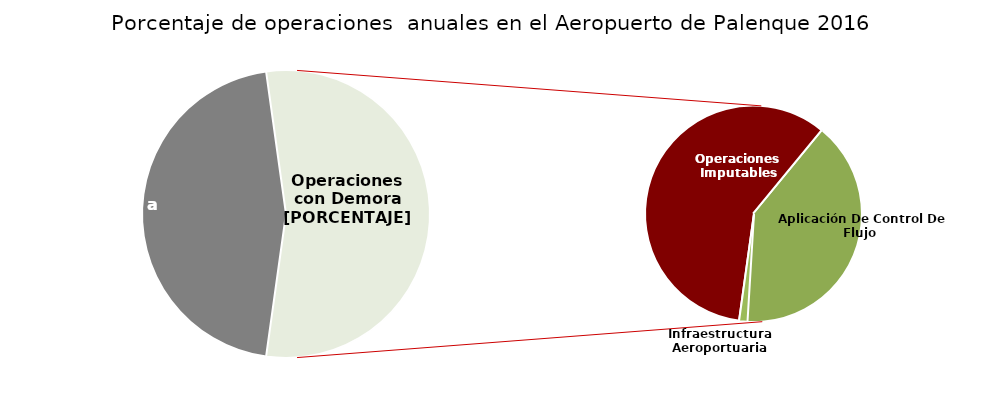
| Category | Series 0 |
|---|---|
| Operaciones a Tiempo | 67 |
| Operaciones Imputables | 47 |
| Aplicación De Control De Flujo  | 32 |
| Infraestructura Aeroportuaria | 1 |